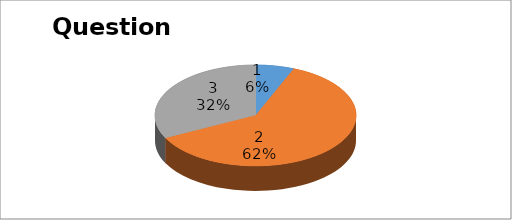
| Category | Series 0 |
|---|---|
| 0 | 13 |
| 1 | 129 |
| 2 | 68 |